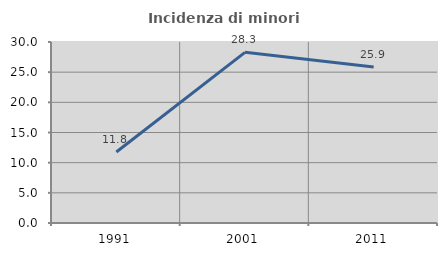
| Category | Incidenza di minori stranieri |
|---|---|
| 1991.0 | 11.765 |
| 2001.0 | 28.289 |
| 2011.0 | 25.874 |